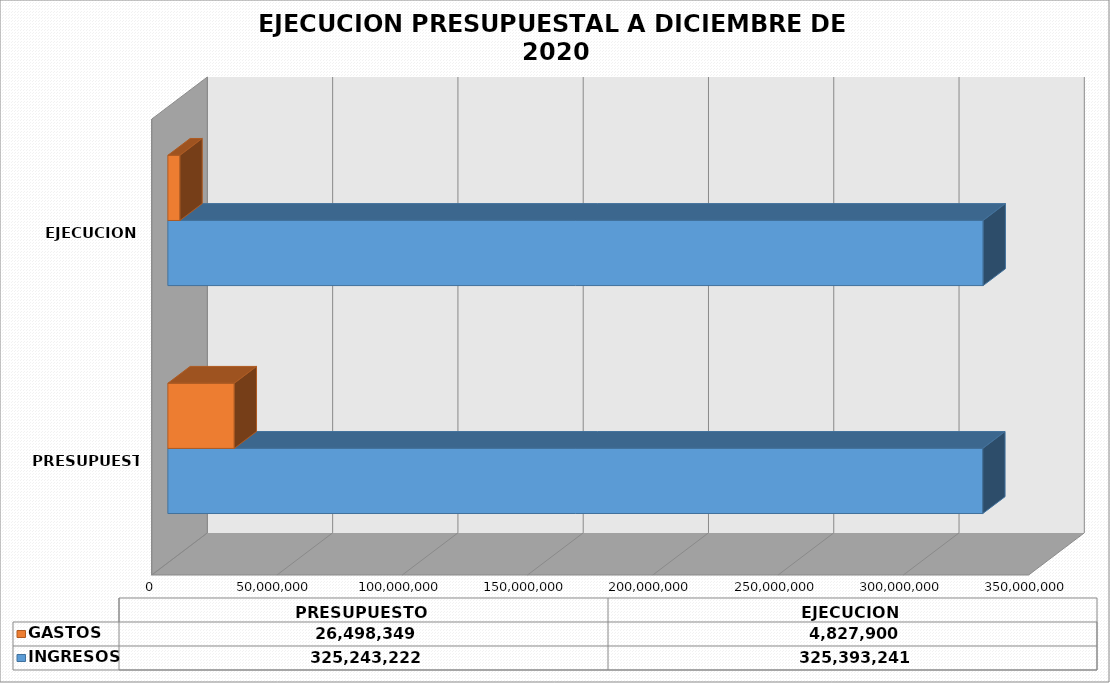
| Category | INGRESOS  | GASTOS |
|---|---|---|
| PRESUPUESTO | 325243222 | 26498349 |
| EJECUCION | 325393241 | 4827900 |